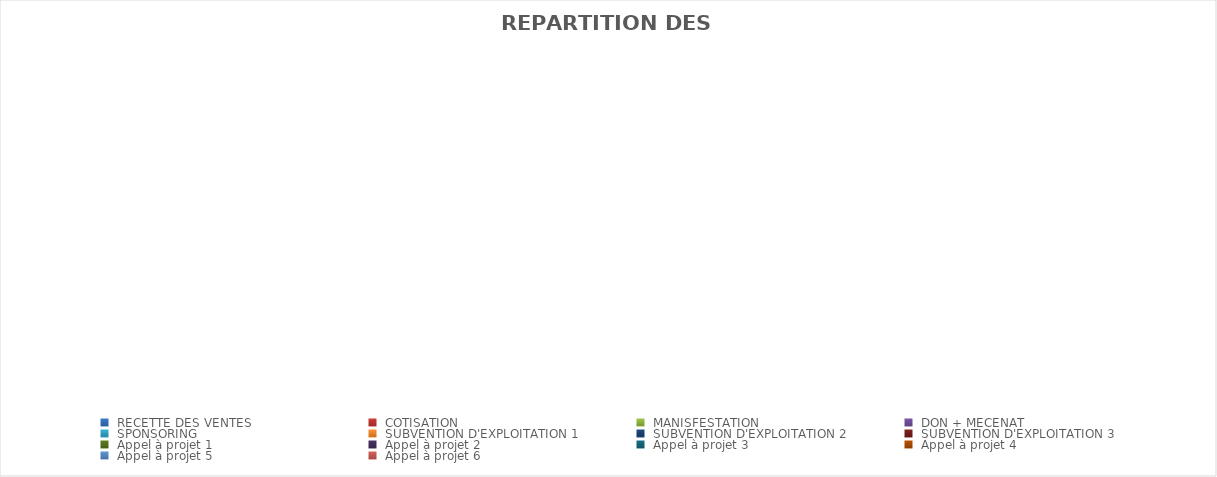
| Category | Series 0 |
|---|---|
|  RECETTE DES VENTES  | 0 |
|  COTISATION  | 0 |
|  MANISFESTATION  | 0 |
|  DON + MECENAT  | 0 |
|  SPONSORING  | 0 |
|  SUBVENTION D'EXPLOITATION 1  | 0 |
|  SUBVENTION D'EXPLOITATION 2  | 0 |
|  SUBVENTION D'EXPLOITATION 3  | 0 |
|  Appel à projet 1  | 0 |
|  Appel à projet 2  | 0 |
|  Appel à projet 3  | 0 |
|  Appel à projet 4  | 0 |
|  Appel à projet 5  | 0 |
|  Appel à projet 6  | 0 |